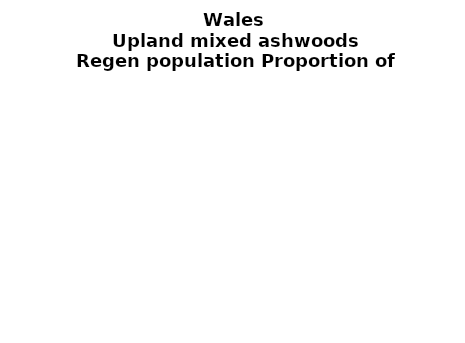
| Category | Upland mixed ashwoods |
|---|---|
| None | 0.101 |
| Seedlings only | 0 |
| Seedlings, saplings only | 0.005 |
| Seedlings, saplings, <7 cm trees | 0.132 |
| Saplings only | 0.107 |
| <7 cm trees, seedlings only | 0 |
| <7 cm trees, saplings only | 0.63 |
| <7 cm Trees only | 0.024 |